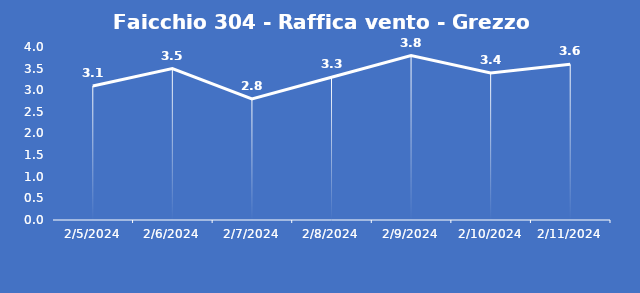
| Category | Faicchio 304 - Raffica vento - Grezzo (m/s) |
|---|---|
| 2/5/24 | 3.1 |
| 2/6/24 | 3.5 |
| 2/7/24 | 2.8 |
| 2/8/24 | 3.3 |
| 2/9/24 | 3.8 |
| 2/10/24 | 3.4 |
| 2/11/24 | 3.6 |